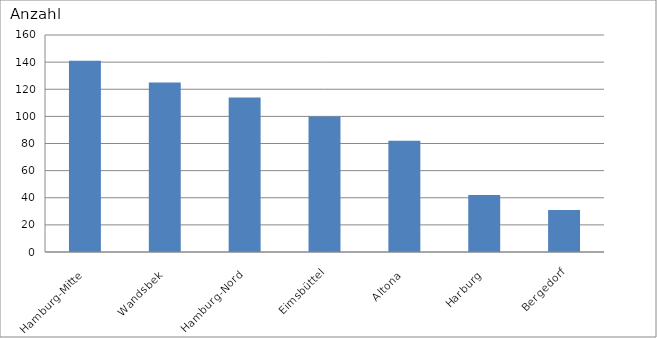
| Category | Hamburg-Mitte Wandsbek Hamburg-Nord Eimsbüttel Altona Harburg Bergedorf |
|---|---|
| Hamburg-Mitte | 141 |
| Wandsbek | 125 |
| Hamburg-Nord | 114 |
| Eimsbüttel | 100 |
| Altona | 82 |
| Harburg | 42 |
| Bergedorf | 31 |